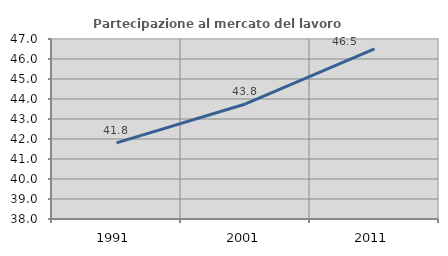
| Category | Partecipazione al mercato del lavoro  femminile |
|---|---|
| 1991.0 | 41.806 |
| 2001.0 | 43.751 |
| 2011.0 | 46.501 |